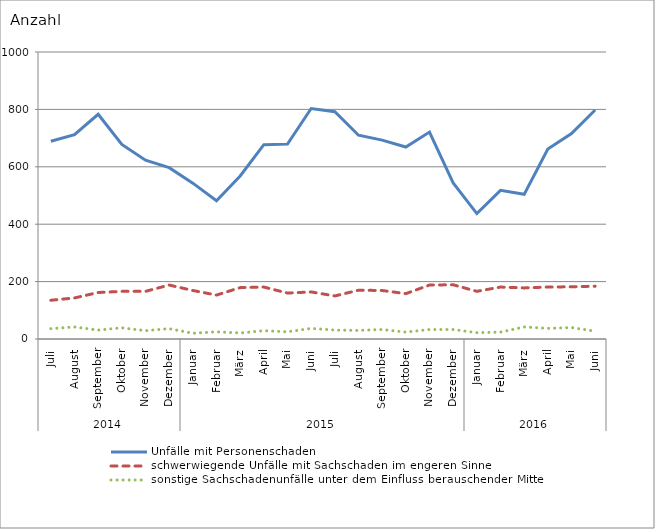
| Category | Unfälle mit Personenschaden | schwerwiegende Unfälle mit Sachschaden im engeren Sinne | sonstige Sachschadenunfälle unter dem Einfluss berauschender Mittel |
|---|---|---|---|
| 0 | 689 | 135 | 36 |
| 1 | 712 | 143 | 42 |
| 2 | 783 | 162 | 31 |
| 3 | 678 | 166 | 39 |
| 4 | 623 | 166 | 29 |
| 5 | 597 | 188 | 36 |
| 6 | 543 | 169 | 20 |
| 7 | 482 | 153 | 25 |
| 8 | 568 | 179 | 21 |
| 9 | 677 | 181 | 29 |
| 10 | 679 | 160 | 25 |
| 11 | 803 | 164 | 37 |
| 12 | 792 | 150 | 31 |
| 13 | 710 | 170 | 30 |
| 14 | 693 | 169 | 33 |
| 15 | 669 | 158 | 24 |
| 16 | 721 | 188 | 33 |
| 17 | 544 | 189 | 33 |
| 18 | 437 | 166 | 22 |
| 19 | 518 | 181 | 24 |
| 20 | 504 | 178 | 42 |
| 21 | 662 | 181 | 37 |
| 22 | 716 | 182 | 40 |
| 23 | 798 | 184 | 27 |